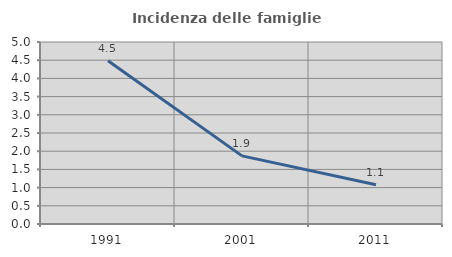
| Category | Incidenza delle famiglie numerose |
|---|---|
| 1991.0 | 4.483 |
| 2001.0 | 1.871 |
| 2011.0 | 1.077 |